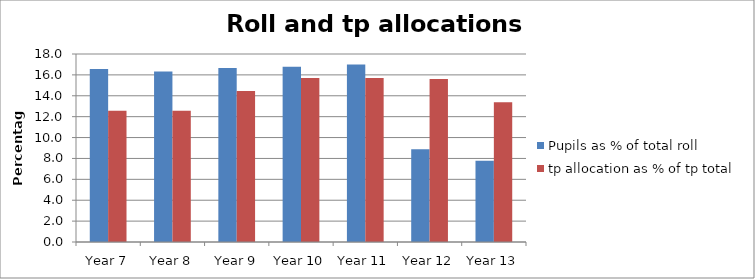
| Category | Pupils as % of total roll | tp allocation as % of tp total |
|---|---|---|
| Year 7 | 16.556 | 12.578 |
| Year 8 | 16.333 | 12.578 |
| Year 9 | 16.667 | 14.451 |
| Year 10 | 16.778 | 15.7 |
| Year 11 | 17 | 15.7 |
| Year 12 | 8.889 | 15.611 |
| Year 13 | 7.778 | 13.381 |